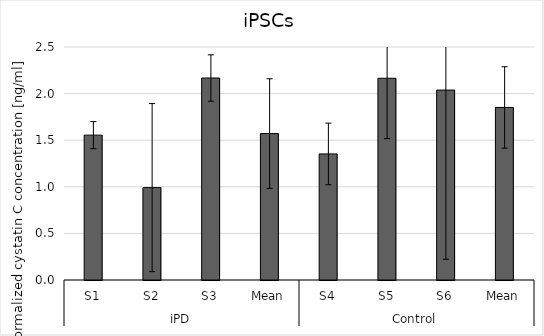
| Category | Series 0 |
|---|---|
| 0 | 1.554 |
| 1 | 0.991 |
| 2 | 2.167 |
| 3 | 1.571 |
| 4 | 1.353 |
| 5 | 2.164 |
| 6 | 2.038 |
| 7 | 1.852 |